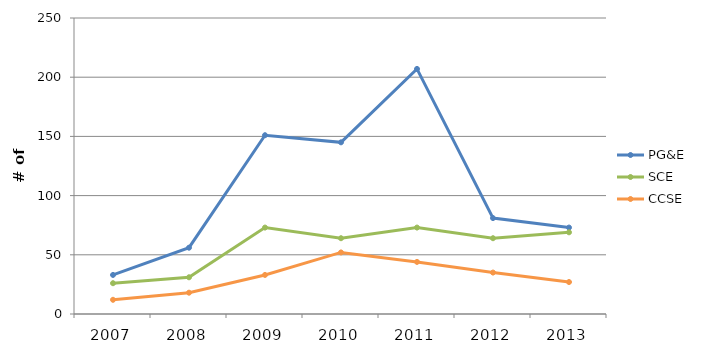
| Category | PG&E | SCE | CCSE |
|---|---|---|---|
| 2007.0 | 33 | 26 | 12 |
| 2008.0 | 56 | 31 | 18 |
| 2009.0 | 151 | 73 | 33 |
| 2010.0 | 145 | 64 | 52 |
| 2011.0 | 207 | 73 | 44 |
| 2012.0 | 81 | 64 | 35 |
| 2013.0 | 73 | 69 | 27 |